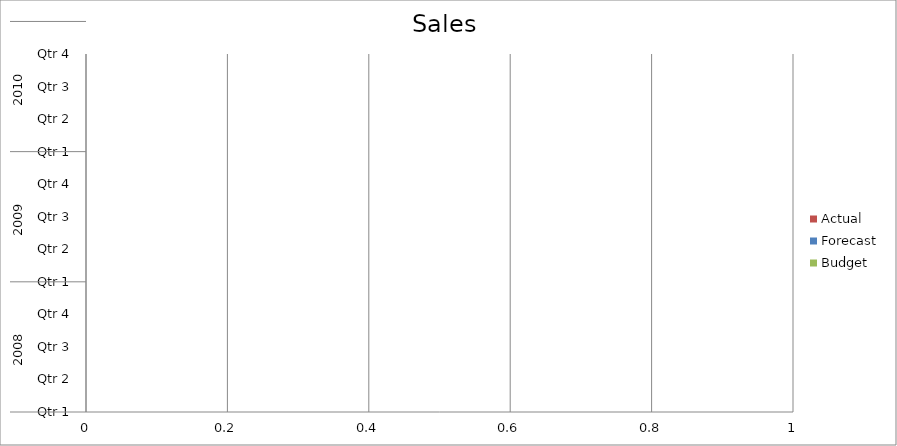
| Category | Budget | Forecast | Actual |
|---|---|---|---|
| 0 | 3090 | 3190 | 1250 |
| 1 | 2350 | 2920 | 1150 |
| 2 | 2230 | 1690 | 880 |
| 3 | 3140 | 2890 | 770 |
| 4 | 2380 | 3390 | 1400 |
| 5 | 3190 | 1420 | 2230 |
| 6 | 1450 | 2580 | 3050 |
| 7 | 1140 | 510 | 840 |
| 8 | 1460 | 1250 | 2360 |
| 9 | 3130 | 2630 | 2250 |
| 10 | 1920 | 3420 | 510 |
| 11 | 2360 | 3470 | 980 |